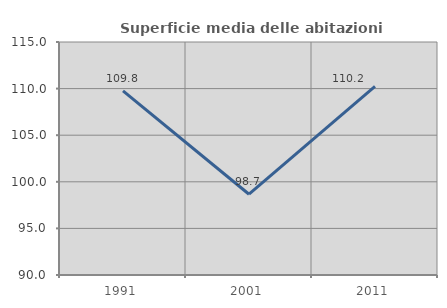
| Category | Superficie media delle abitazioni occupate |
|---|---|
| 1991.0 | 109.758 |
| 2001.0 | 98.667 |
| 2011.0 | 110.248 |